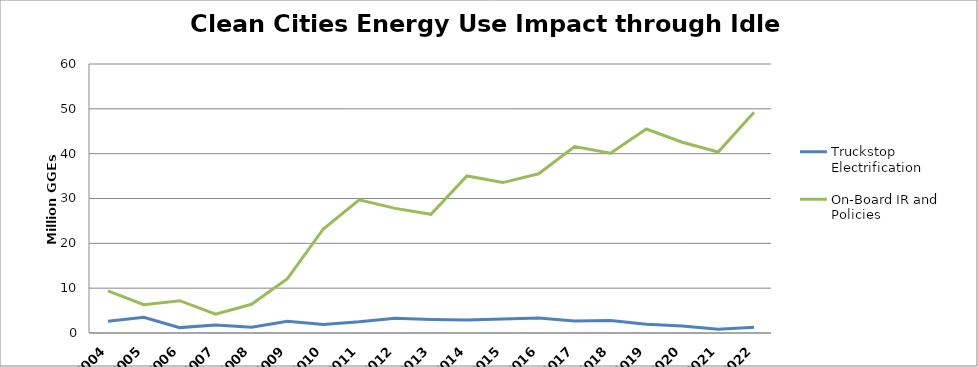
| Category | Truckstop Electrification | On-Board IR and Policies |
|---|---|---|
| 2004.0 | 2.6 | 9.4 |
| 2005.0 | 3.5 | 6.3 |
| 2006.0 | 1.2 | 7.2 |
| 2007.0 | 1.8 | 4.2 |
| 2008.0 | 1.3 | 6.4 |
| 2009.0 | 2.6 | 12.1 |
| 2010.0 | 1.9 | 23.2 |
| 2011.0 | 2.5 | 29.7 |
| 2012.0 | 3.3 | 27.8 |
| 2013.0 | 3.02 | 26.48 |
| 2014.0 | 2.91 | 35.034 |
| 2015.0 | 3.145 | 33.55 |
| 2016.0 | 3.371 | 35.518 |
| 2017.0 | 2.666 | 41.574 |
| 2018.0 | 2.772 | 40.088 |
| 2019.0 | 1.929 | 45.509 |
| 2020.0 | 1.567 | 42.545 |
| 2021.0 | 0.831 | 40.372 |
| 2022.0 | 1.268 | 49.213 |